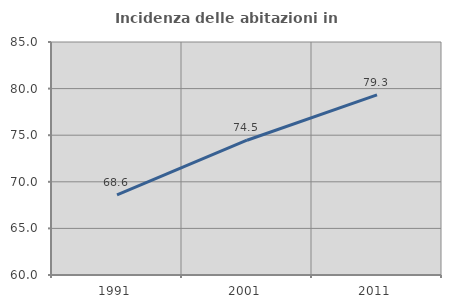
| Category | Incidenza delle abitazioni in proprietà  |
|---|---|
| 1991.0 | 68.602 |
| 2001.0 | 74.46 |
| 2011.0 | 79.321 |